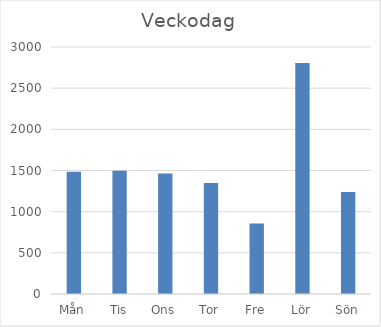
| Category | Summa |
|---|---|
| Mån | 1486 |
| Tis | 1498 |
| Ons | 1465 |
| Tor | 1347 |
| Fre | 855 |
| Lör | 2805 |
| Sön | 1240 |